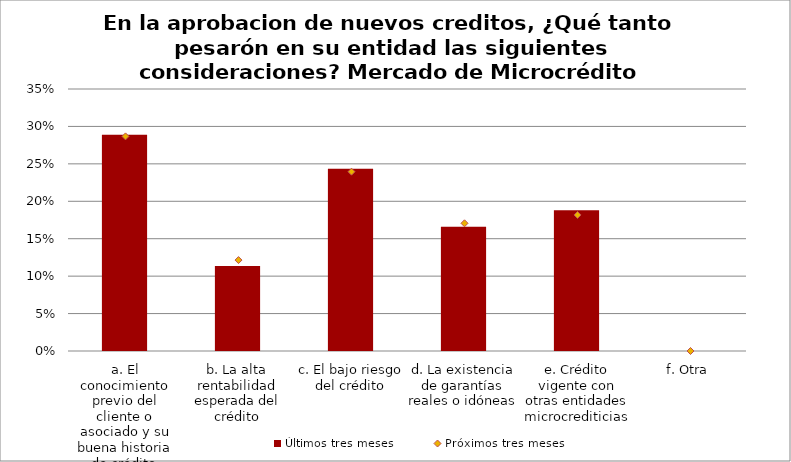
| Category | Últimos tres meses |
|---|---|
| a. El conocimiento previo del cliente o asociado y su buena historia de crédito | 0.289 |
| b. La alta rentabilidad esperada del crédito | 0.114 |
| c. El bajo riesgo del crédito | 0.243 |
| d. La existencia de garantías reales o idóneas | 0.166 |
| e. Crédito vigente con otras entidades microcrediticias | 0.188 |
| f. Otra | 0 |